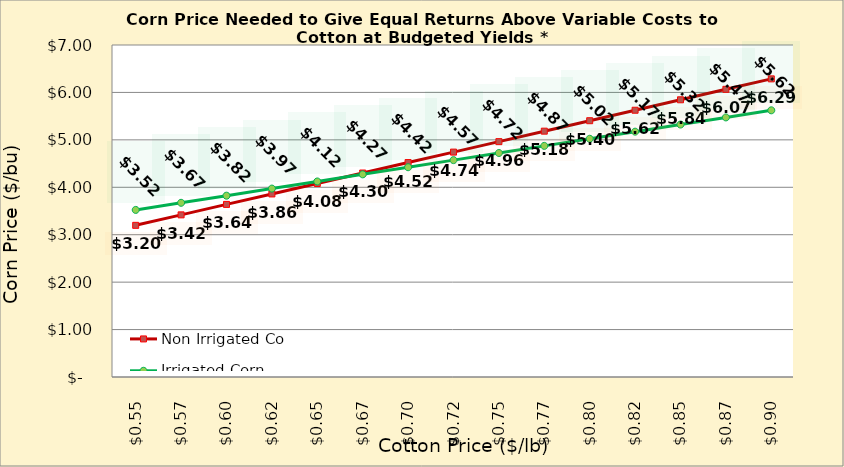
| Category | Non Irrigated Corn | Irrigated Corn |
|---|---|---|
| 0.5449999999999998 | 3.198 | 3.523 |
| 0.5699999999999998 | 3.418 | 3.673 |
| 0.5949999999999999 | 3.639 | 3.823 |
| 0.6199999999999999 | 3.86 | 3.973 |
| 0.6449999999999999 | 4.08 | 4.123 |
| 0.6699999999999999 | 4.301 | 4.273 |
| 0.695 | 4.521 | 4.423 |
| 0.72 | 4.742 | 4.573 |
| 0.745 | 4.963 | 4.723 |
| 0.77 | 5.183 | 4.873 |
| 0.795 | 5.404 | 5.023 |
| 0.8200000000000001 | 5.624 | 5.173 |
| 0.8450000000000001 | 5.845 | 5.323 |
| 0.8700000000000001 | 6.065 | 5.473 |
| 0.8950000000000001 | 6.286 | 5.623 |